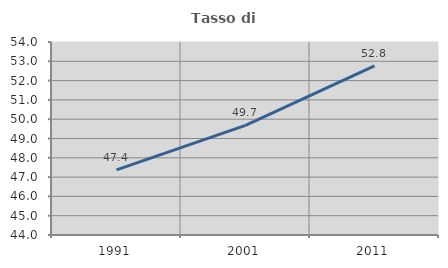
| Category | Tasso di occupazione   |
|---|---|
| 1991.0 | 47.374 |
| 2001.0 | 49.683 |
| 2011.0 | 52.758 |